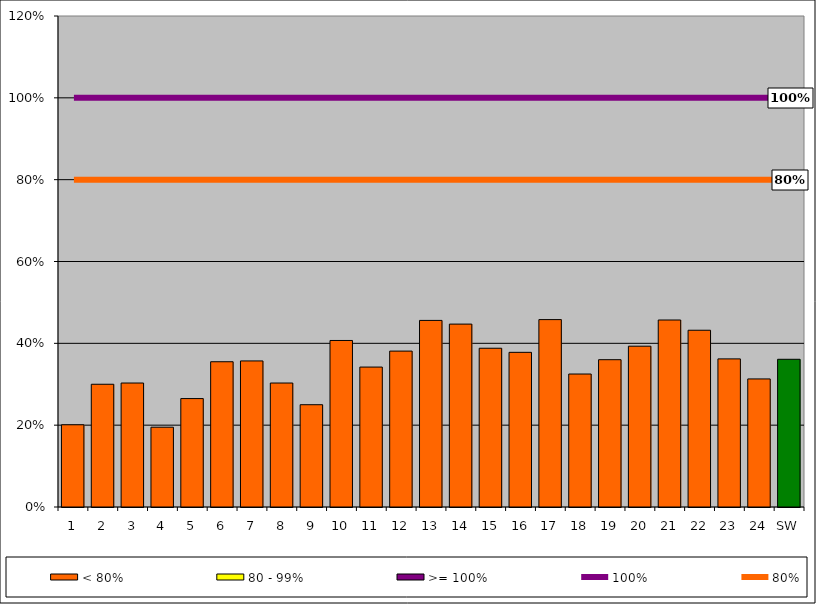
| Category | < 80% | 80 - 99% | >= 100% |
|---|---|---|---|
| 1 | 0.201 | 0 | 0 |
| 2 | 0.3 | 0 | 0 |
| 3 | 0.303 | 0 | 0 |
| 4 | 0.195 | 0 | 0 |
| 5 | 0.265 | 0 | 0 |
| 6 | 0.355 | 0 | 0 |
| 7 | 0.357 | 0 | 0 |
| 8 | 0.303 | 0 | 0 |
| 9 | 0.25 | 0 | 0 |
| 10 | 0.407 | 0 | 0 |
| 11 | 0.342 | 0 | 0 |
| 12 | 0.381 | 0 | 0 |
| 13 | 0.456 | 0 | 0 |
| 14 | 0.447 | 0 | 0 |
| 15 | 0.388 | 0 | 0 |
| 16 | 0.378 | 0 | 0 |
| 17 | 0.458 | 0 | 0 |
| 18 | 0.325 | 0 | 0 |
| 19 | 0.36 | 0 | 0 |
| 20 | 0.393 | 0 | 0 |
| 21 | 0.457 | 0 | 0 |
| 22 | 0.432 | 0 | 0 |
| 23 | 0.362 | 0 | 0 |
| 24 | 0.313 | 0 | 0 |
| SW | 0.361 | 0 | 0 |